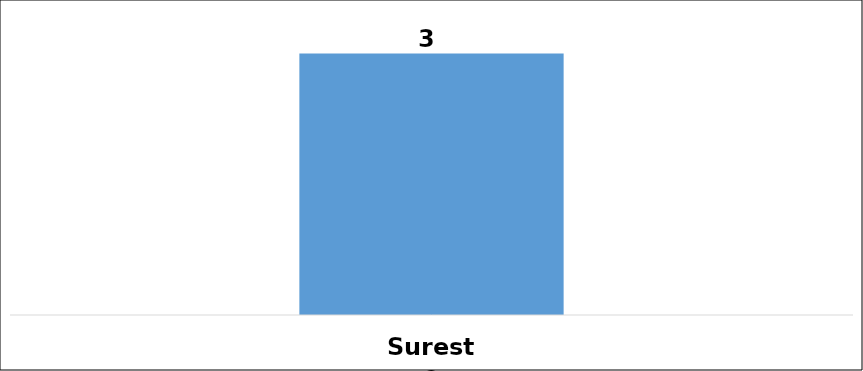
| Category | Total |
|---|---|
| Sureste | 3 |